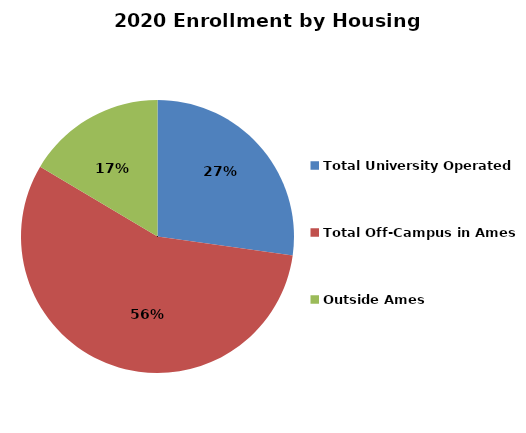
| Category | Series 0 |
|---|---|
| Total University Operated | 0.271 |
| Total Off-Campus in Ames | 0.561 |
| Outside Ames | 0.164 |